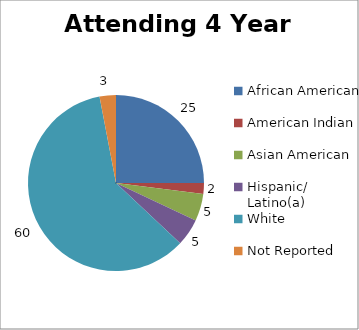
| Category | Attending 4 year college |
|---|---|
| African American | 25 |
| American Indian | 2 |
| Asian American | 5 |
| Hispanic/ Latino(a) | 5 |
| White | 60 |
| Not Reported | 3 |